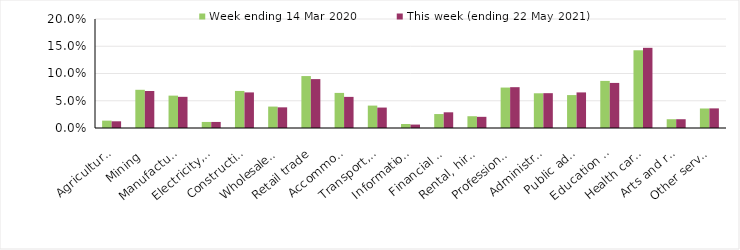
| Category | Week ending 14 Mar 2020 | This week (ending 22 May 2021) |
|---|---|---|
| Agriculture, forestry and fishing | 0.014 | 0.012 |
| Mining | 0.07 | 0.068 |
| Manufacturing | 0.059 | 0.057 |
| Electricity, gas, water and waste services | 0.011 | 0.011 |
| Construction | 0.068 | 0.065 |
| Wholesale trade | 0.039 | 0.038 |
| Retail trade | 0.095 | 0.09 |
| Accommodation and food services | 0.064 | 0.057 |
| Transport, postal and warehousing | 0.041 | 0.038 |
| Information media and telecommunications | 0.007 | 0.006 |
| Financial and insurance services | 0.026 | 0.029 |
| Rental, hiring and real estate services | 0.022 | 0.02 |
| Professional, scientific and technical services | 0.074 | 0.075 |
| Administrative and support services | 0.064 | 0.064 |
| Public administration and safety | 0.06 | 0.065 |
| Education and training | 0.086 | 0.083 |
| Health care and social assistance | 0.143 | 0.147 |
| Arts and recreation services | 0.016 | 0.016 |
| Other services | 0.036 | 0.036 |